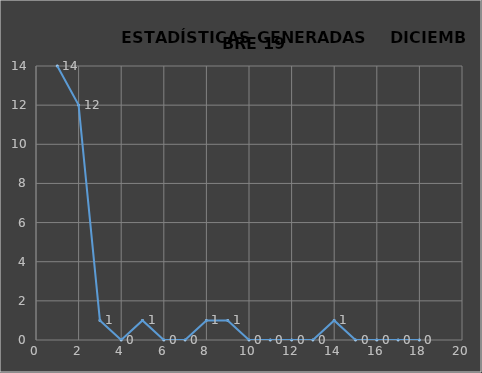
| Category |                   ESTADÍSTICAS GENERADAS  |
|---|---|
| 0 | 14 |
| 1 | 12 |
| 2 | 1 |
| 3 | 0 |
| 4 | 1 |
| 5 | 0 |
| 6 | 0 |
| 7 | 1 |
| 8 | 1 |
| 9 | 0 |
| 10 | 0 |
| 11 | 0 |
| 12 | 0 |
| 13 | 1 |
| 14 | 0 |
| 15 | 0 |
| 16 | 0 |
| 17 | 0 |